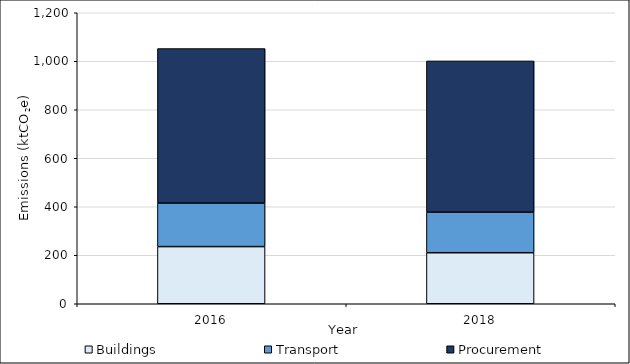
| Category | Buildings | Transport | Procurement |
|---|---|---|---|
| 2016.0 | 235.634 | 179.406 | 637.283 |
| 2018.0 | 210.436 | 167.191 | 623.75 |